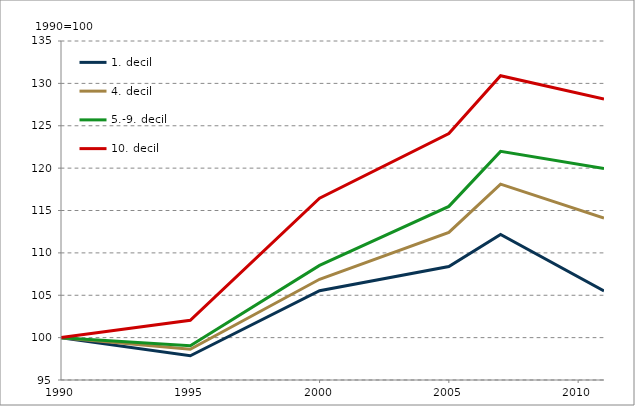
| Category | 1. decil | 4. decil | 5.-9. decil | 10. decil |
|---|---|---|---|---|
| 1990.0 | 100 | 100 | 100 | 100 |
| 1995.0 | 97.853 | 98.631 | 99.047 | 102.052 |
| 2000.0 | 105.539 | 106.882 | 108.518 | 116.452 |
| 2005.0 | 108.393 | 112.411 | 115.486 | 124.079 |
| 2007.0 | 112.17 | 118.118 | 121.978 | 130.906 |
| 2011.0 | 105.506 | 114.1 | 119.962 | 128.148 |